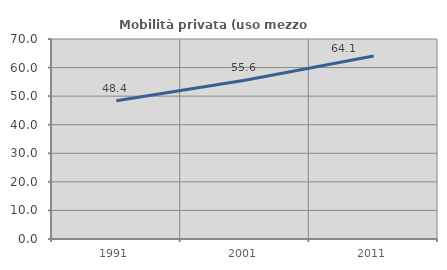
| Category | Mobilità privata (uso mezzo privato) |
|---|---|
| 1991.0 | 48.406 |
| 2001.0 | 55.556 |
| 2011.0 | 64.068 |